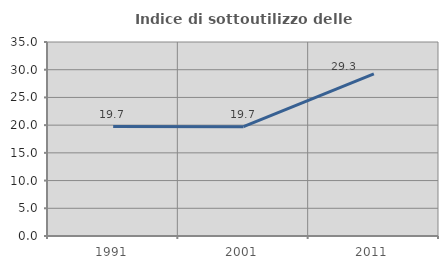
| Category | Indice di sottoutilizzo delle abitazioni  |
|---|---|
| 1991.0 | 19.749 |
| 2001.0 | 19.726 |
| 2011.0 | 29.25 |